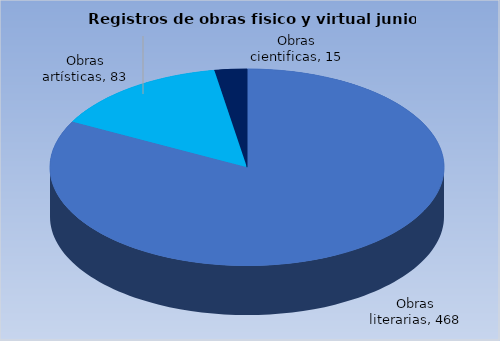
| Category | Series 0 |
|---|---|
| Obras literarias | 468 |
| Obras artísticas | 83 |
| Obras cientificas | 15 |